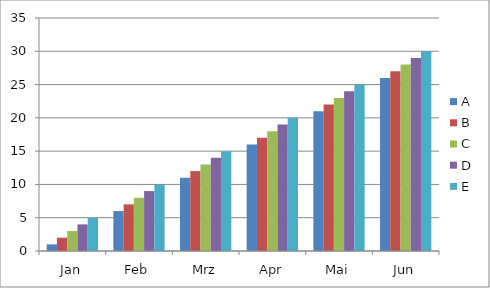
| Category | A | B | C | D | E |
|---|---|---|---|---|---|
| Jan | 1 | 2 | 3 | 4 | 5 |
| Feb | 6 | 7 | 8 | 9 | 10 |
| Mrz | 11 | 12 | 13 | 14 | 15 |
| Apr | 16 | 17 | 18 | 19 | 20 |
| Mai | 21 | 22 | 23 | 24 | 25 |
| Jun | 26 | 27 | 28 | 29 | 30 |